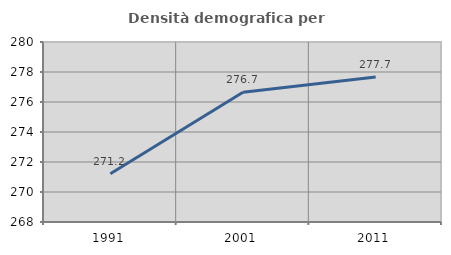
| Category | Densità demografica |
|---|---|
| 1991.0 | 271.223 |
| 2001.0 | 276.653 |
| 2011.0 | 277.667 |